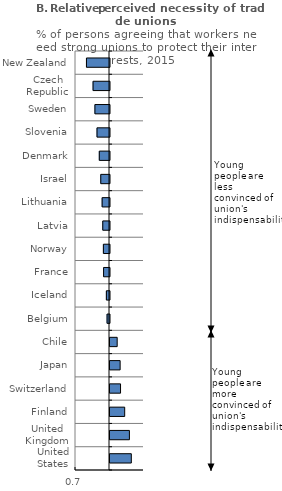
| Category | 2015 |
|---|---|
| United States | 1.188 |
| United Kingdom | 1.171 |
| Finland | 1.13 |
| Switzerland | 1.093 |
| Japan | 1.089 |
| Chile | 1.063 |
| Belgium | 0.979 |
| Iceland | 0.972 |
| France | 0.948 |
| Norway | 0.946 |
| Latvia | 0.941 |
| Lithuania | 0.935 |
| Israel | 0.923 |
| Denmark | 0.91 |
| Slovenia | 0.89 |
| Sweden | 0.871 |
| Czech Republic | 0.855 |
| New Zealand | 0.797 |